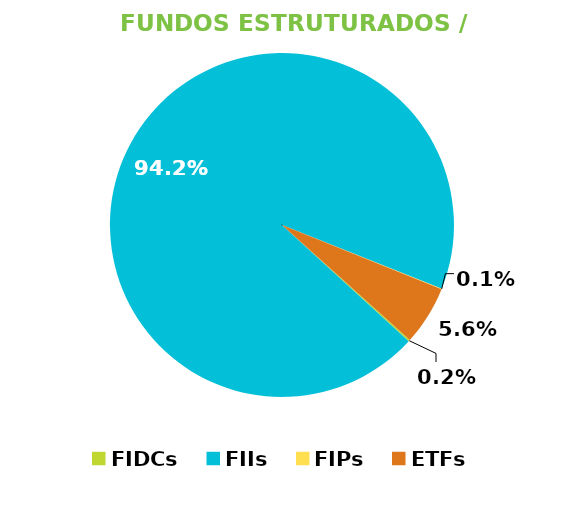
| Category | Fundos Estruturados / ETFs |
|---|---|
| FIDCs | 0.002 |
| FIIs | 0.942 |
| FIPs | 0.001 |
| ETFs | 0.056 |